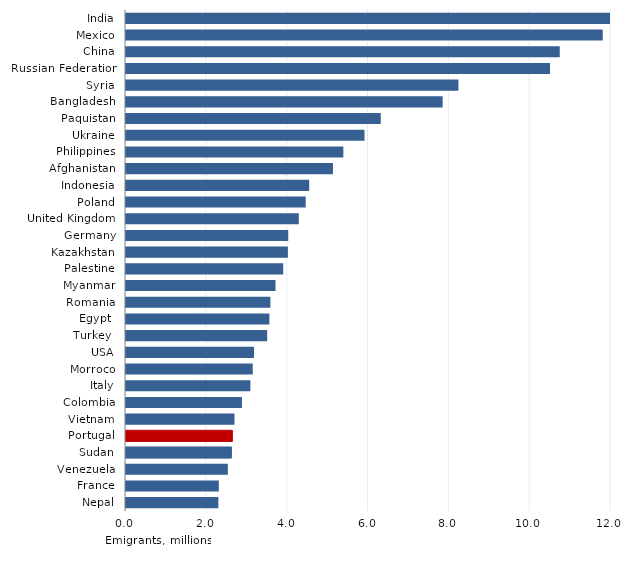
| Category | Series 0 |
|---|---|
| India | 17.511 |
| Mexico | 11.796 |
| China | 10.732 |
| Russian Federation | 10.492 |
| Syria | 8.225 |
| Bangladesh | 7.835 |
| Paquistan | 6.303 |
| Ukraine | 5.901 |
| Philippines | 5.377 |
| Afghanistan | 5.121 |
| Indonesia | 4.533 |
| Poland | 4.447 |
| United Kingdom | 4.275 |
| Germany | 4.014 |
| Kazakhstan | 4.006 |
| Palestine | 3.891 |
| Myanmar | 3.699 |
| Romania | 3.573 |
| Egypt  | 3.548 |
| Turkey  | 3.493 |
| USA | 3.167 |
| Morroco | 3.136 |
| Italy | 3.078 |
| Colombia | 2.869 |
| Vietnam | 2.684 |
| Portugal | 2.632 |
| Sudan | 2.608 |
| Venezuela | 2.52 |
| France | 2.297 |
| Nepal | 2.285 |